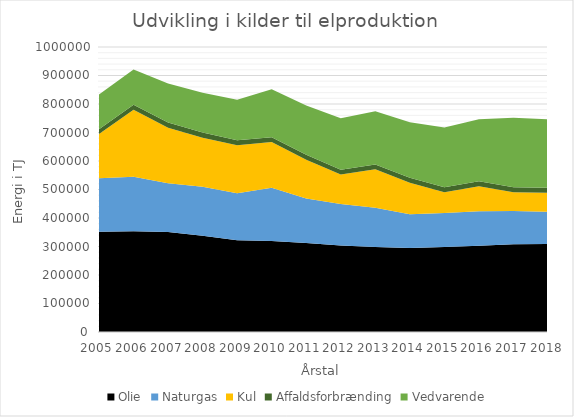
| Category | Olie | Naturgas | Kul | Affaldsforbrænding | Vedvarende |
|---|---|---|---|---|---|
| 2005.0 | 351823.131 | 187220.096 | 155255.094 | 17006.34 | 121879.5 |
| 2006.0 | 353742.71 | 190738.467 | 235590.25 | 17291.62 | 124010.26 |
| 2007.0 | 351139.846 | 170962.607 | 194789.92 | 17889.14 | 137479.21 |
| 2008.0 | 337982.406 | 171777.958 | 171558.124 | 18679.21 | 139043.24 |
| 2009.0 | 321700.605 | 164980.522 | 168780.046 | 17705.01 | 141776.91 |
| 2010.0 | 319383.57 | 186623.227 | 160465.197 | 17147.95 | 167944.29 |
| 2011.0 | 312328.616 | 156505.124 | 135577.795 | 17292.31 | 173113.38 |
| 2012.0 | 303115.772 | 146177.804 | 103547.462 | 16804.98 | 180202.68 |
| 2013.0 | 297907.882 | 137872.17 | 135485.321 | 16856.35 | 186692.44 |
| 2014.0 | 295075.794 | 118419.776 | 109958.504 | 17422.54 | 194867.46 |
| 2015.0 | 298426.272 | 119133.094 | 72362.726 | 17861.06 | 210040.19 |
| 2016.0 | 302510.905 | 121149.118 | 87676.311 | 17776.61 | 217510.14 |
| 2017.0 | 308067.505 | 116385.111 | 65590.802 | 17840.32 | 244159.6 |
| 2018.0 | 308577.097 | 113045.656 | 66903.374 | 17883.757 | 239821.59 |